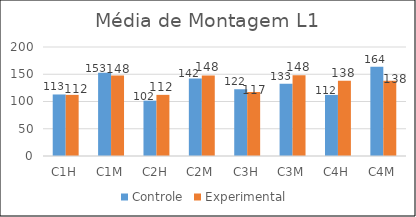
| Category | Controle | Experimental  |
|---|---|---|
| C1H | 112.9 | 112.15 |
| C1M | 152.6 | 147.875 |
| C2H | 101.55 | 112.175 |
| C2M | 142.4 | 147.875 |
| C3H | 122.25 | 117.45 |
| C3M | 132.55 | 148.35 |
| C4H | 112.1 | 138.025 |
| C4M | 163.95 | 138.025 |